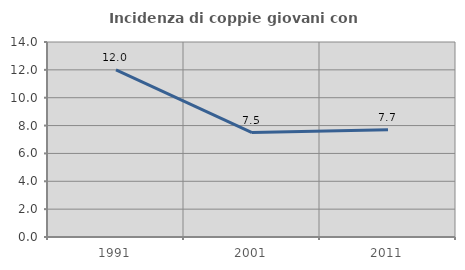
| Category | Incidenza di coppie giovani con figli |
|---|---|
| 1991.0 | 11.994 |
| 2001.0 | 7.498 |
| 2011.0 | 7.708 |